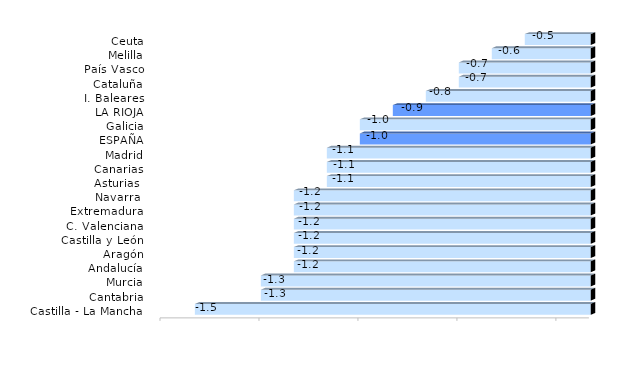
| Category | Series 0 |
|---|---|
| Castilla - La Mancha | -1.5 |
| Cantabria | -1.3 |
| Murcia | -1.3 |
| Andalucía | -1.2 |
| Aragón | -1.2 |
| Castilla y León | -1.2 |
| C. Valenciana | -1.2 |
| Extremadura | -1.2 |
| Navarra  | -1.2 |
| Asturias  | -1.1 |
| Canarias | -1.1 |
| Madrid | -1.1 |
| ESPAÑA | -1 |
| Galicia | -1 |
| LA RIOJA | -0.9 |
| I. Baleares | -0.8 |
| Cataluña | -0.7 |
| País Vasco | -0.7 |
| Melilla | -0.6 |
| Ceuta | -0.5 |